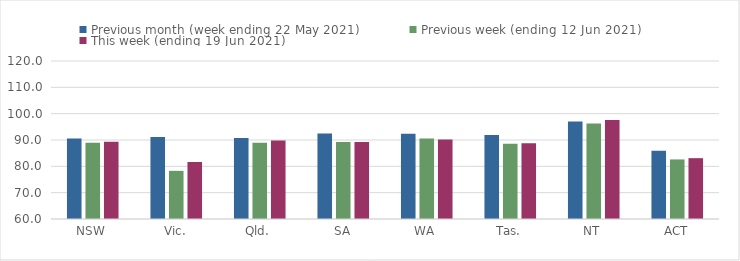
| Category | Previous month (week ending 22 May 2021) | Previous week (ending 12 Jun 2021) | This week (ending 19 Jun 2021) |
|---|---|---|---|
| NSW | 90.59 | 89 | 89.29 |
| Vic. | 91.11 | 78.28 | 81.64 |
| Qld. | 90.79 | 88.96 | 89.83 |
| SA | 92.49 | 89.24 | 89.24 |
| WA | 92.33 | 90.55 | 90.18 |
| Tas. | 91.88 | 88.57 | 88.75 |
| NT | 97.03 | 96.24 | 97.59 |
| ACT | 85.89 | 82.62 | 83.1 |